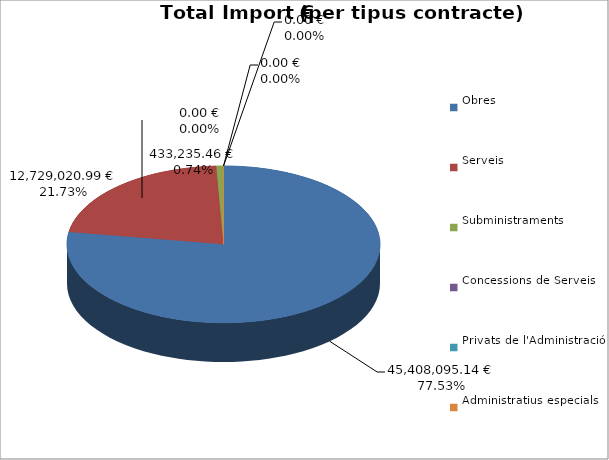
| Category | Total preu
(amb IVA) |
|---|---|
| Obres | 45408095.138 |
| Serveis | 12729020.988 |
| Subministraments | 433235.46 |
| Concessions de Serveis | 0 |
| Privats de l'Administració | 0 |
| Administratius especials | 0 |